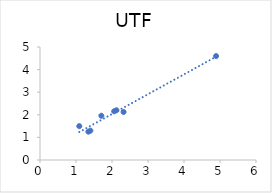
| Category | Series 0 |
|---|---|
| 2.05975039960654 | 2.156 |
| 1.3429259279995522 | 1.253 |
| 4.891094781417363 | 4.599 |
| 1.7042355998267649 | 1.959 |
| 1.399967200824665 | 1.299 |
| 1.0911732081911263 | 1.499 |
| 2.1233564559356775 | 2.2 |
| 2.320963255745864 | 2.126 |